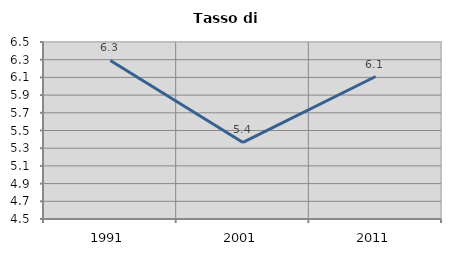
| Category | Tasso di disoccupazione   |
|---|---|
| 1991.0 | 6.291 |
| 2001.0 | 5.365 |
| 2011.0 | 6.11 |